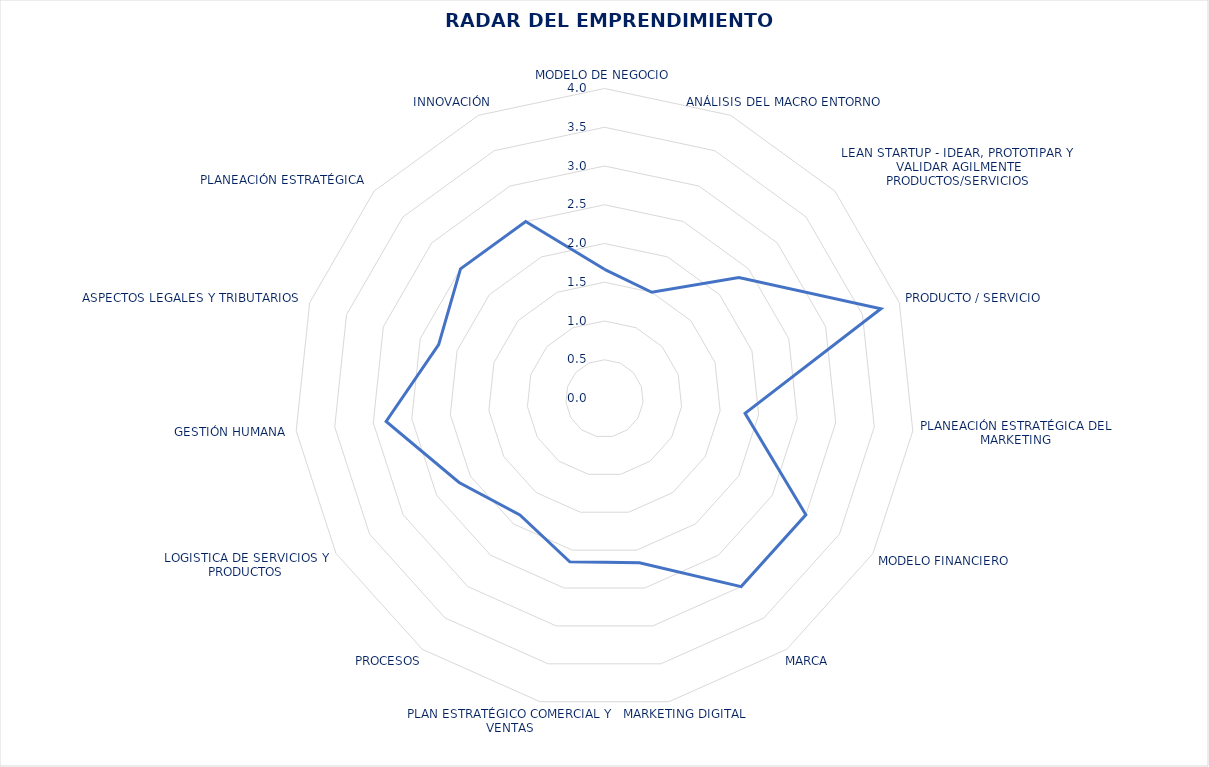
| Category | CALIFICACIÓN 
OBTENIDA |
|---|---|
| MODELO DE NEGOCIO | 1.667 |
| ANÁLISIS DEL MACRO ENTORNO | 1.5 |
| LEAN STARTUP - IDEAR, PROTOTIPAR Y VALIDAR AGILMENTE PRODUCTOS/SERVICIOS | 2.333 |
| PRODUCTO / SERVICIO | 3.75 |
| PLANEACIÓN ESTRATÉGICA DEL MARKETING | 1.824 |
| MODELO FINANCIERO  | 3 |
| MARCA | 3 |
| MARKETING DIGITAL | 2.167 |
| PLAN ESTRATÉGICO COMERCIAL Y VENTAS | 2.154 |
| PROCESOS | 1.857 |
| LOGISTICA DE SERVICIOS Y PRODUCTOS | 2.167 |
| GESTIÓN HUMANA | 2.833 |
| ASPECTOS LEGALES Y TRIBUTARIOS | 2.25 |
| PLANEACIÓN ESTRATÉGICA | 2.5 |
| INNOVACIÓN | 2.5 |